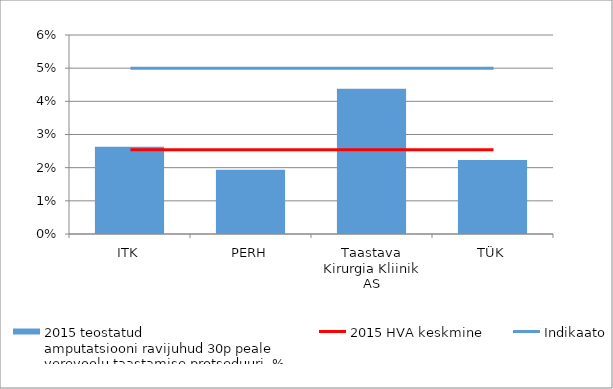
| Category | 2015 teostatud
amputatsiooni ravijuhud 30p peale
verevoolu taastamise protseduuri, % |
|---|---|
| ITK | 0.026 |
| PERH | 0.019 |
| Taastava Kirurgia Kliinik AS | 0.044 |
| TÜK | 0.022 |